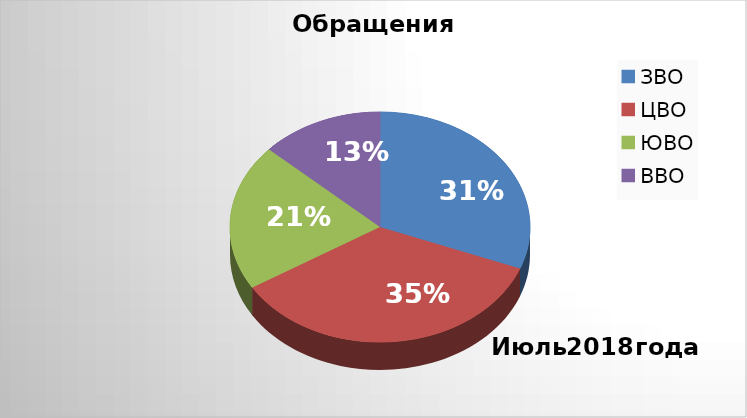
| Category | Series 0 |
|---|---|
| ЗВО | 21 |
| ЦВО | 24 |
| ЮВО | 14 |
| ВВО | 9 |